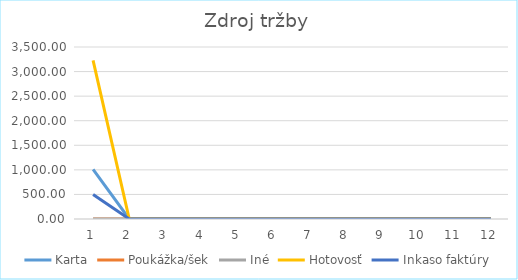
| Category | Karta | Poukážka/šek | Iné | Hotovosť | Inkaso faktúry |
|---|---|---|---|---|---|
| 0 | 1011 | 0 | 0 | 3226.4 | 500 |
| 1 | 0 | 0 | 0 | 0 | 0 |
| 2 | 0 | 0 | 0 | 0 | 0 |
| 3 | 0 | 0 | 0 | 0 | 0 |
| 4 | 0 | 0 | 0 | 0 | 0 |
| 5 | 0 | 0 | 0 | 0 | 0 |
| 6 | 0 | 0 | 0 | 0 | 0 |
| 7 | 0 | 0 | 0 | 0 | 0 |
| 8 | 0 | 0 | 0 | 0 | 0 |
| 9 | 0 | 0 | 0 | 0 | 0 |
| 10 | 0 | 0 | 0 | 0 | 0 |
| 11 | 0 | 0 | 0 | 0 | 0 |